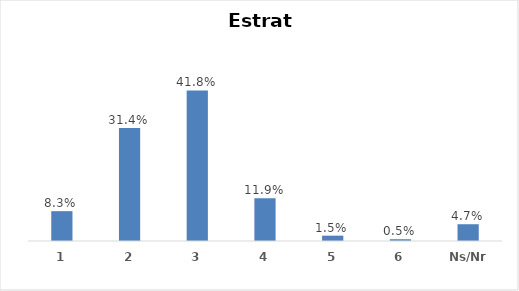
| Category | Series 0 |
|---|---|
| 1 | 0.083 |
| 2 | 0.314 |
| 3 | 0.418 |
| 4 | 0.119 |
| 5 | 0.015 |
| 6 | 0.005 |
| Ns/Nr | 0.047 |